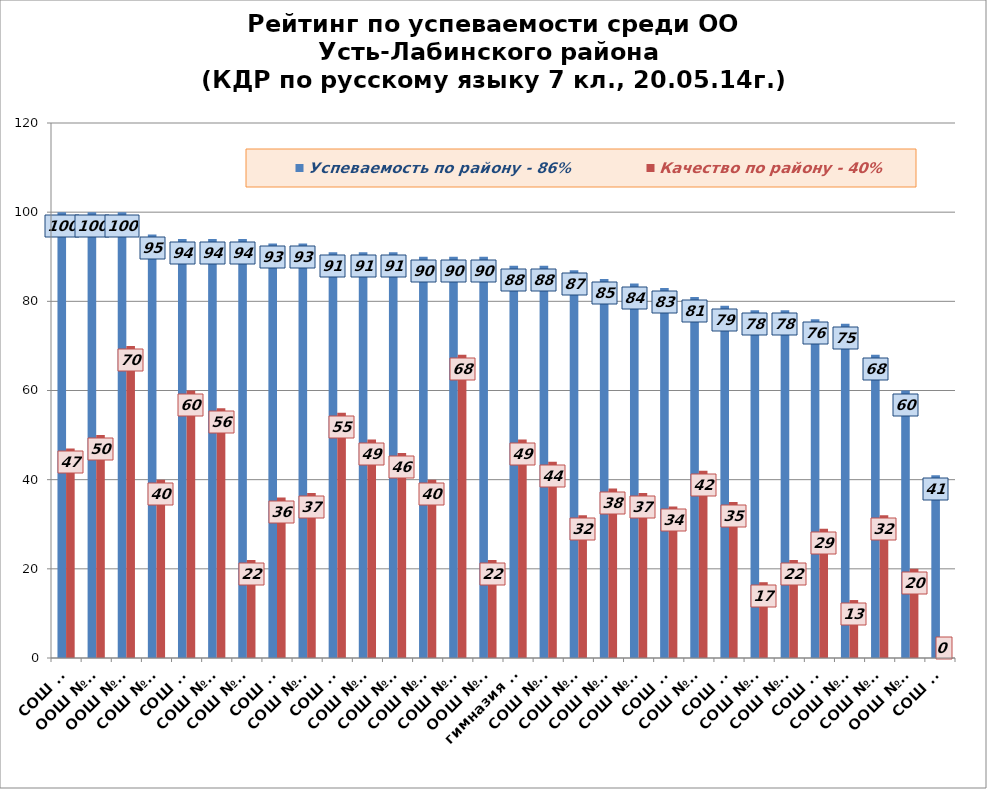
| Category | Успеваемость по району - 86% | Качество по району - 40% |
|---|---|---|
| СОШ №1 | 100 | 47 |
| ООШ №27 | 100 | 50 |
| ООШ №28 | 100 | 70 |
| СОШ №23 | 95 | 40 |
| СОШ №2 | 94 | 60 |
| СОШ №18 | 94 | 56 |
| СОШ №22 | 94 | 22 |
| СОШ №8 | 93 | 36 |
| СОШ №19 | 93 | 37 |
| СОШ №4 | 91 | 55 |
| СОШ №10 | 91 | 49 |
| СОШ №25 | 91 | 46 |
| СОШ №12 | 90 | 40 |
| СОШ №16 | 90 | 68 |
| ООШ №26 | 90 | 22 |
| гимназия №5 | 88 | 49 |
| СОШ №24 | 88 | 44 |
| СОШ №11 | 87 | 32 |
| СОШ №36 | 85 | 38 |
| СОШ №15 | 84 | 37 |
| СОШ №6 | 83 | 34 |
| СОШ №13 | 81 | 42 |
| СОШ №3 | 79 | 35 |
| СОШ №14 | 78 | 17 |
| СОШ №21 | 78 | 22 |
| СОШ №7 | 76 | 29 |
| СОШ №17 | 75 | 13 |
| СОШ №20 | 68 | 32 |
| ООШ №31 | 60 | 20 |
| СОШ №9 | 41 | 0 |